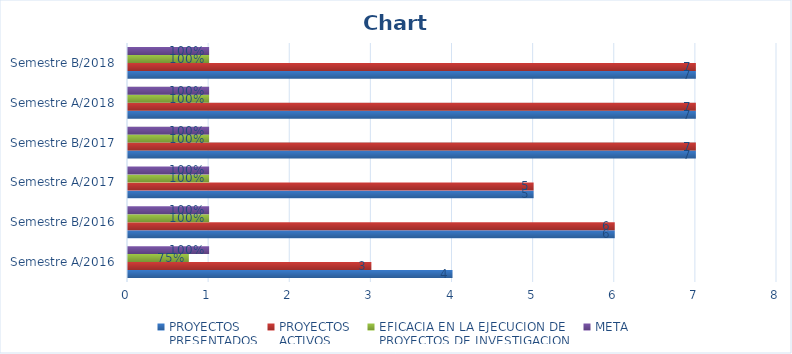
| Category | PROYECTOS
PRESENTADOS | PROYECTOS
ACTIVOS | EFICACIA EN LA EJECUCION DE 
PROYECTOS DE INVESTIGACION | META |
|---|---|---|---|---|
| Semestre A/2016 | 4 | 3 | 0.75 | 1 |
| Semestre B/2016 | 6 | 6 | 1 | 1 |
| Semestre A/2017 | 5 | 5 | 1 | 1 |
| Semestre B/2017 | 7 | 7 | 1 | 1 |
| Semestre A/2018 | 7 | 7 | 1 | 1 |
| Semestre B/2018 | 7 | 7 | 1 | 1 |